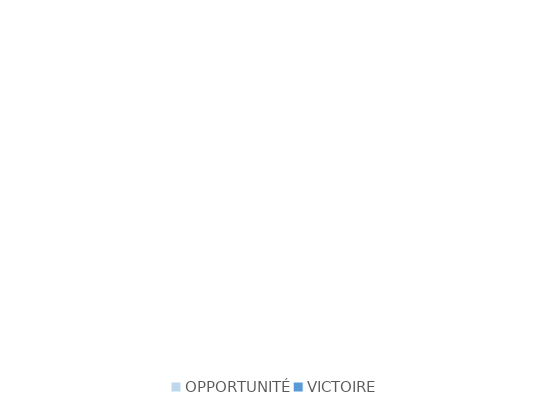
| Category | Series 0 |
|---|---|
| OPPORTUNITÉ | 0 |
| VICTOIRE | 0 |